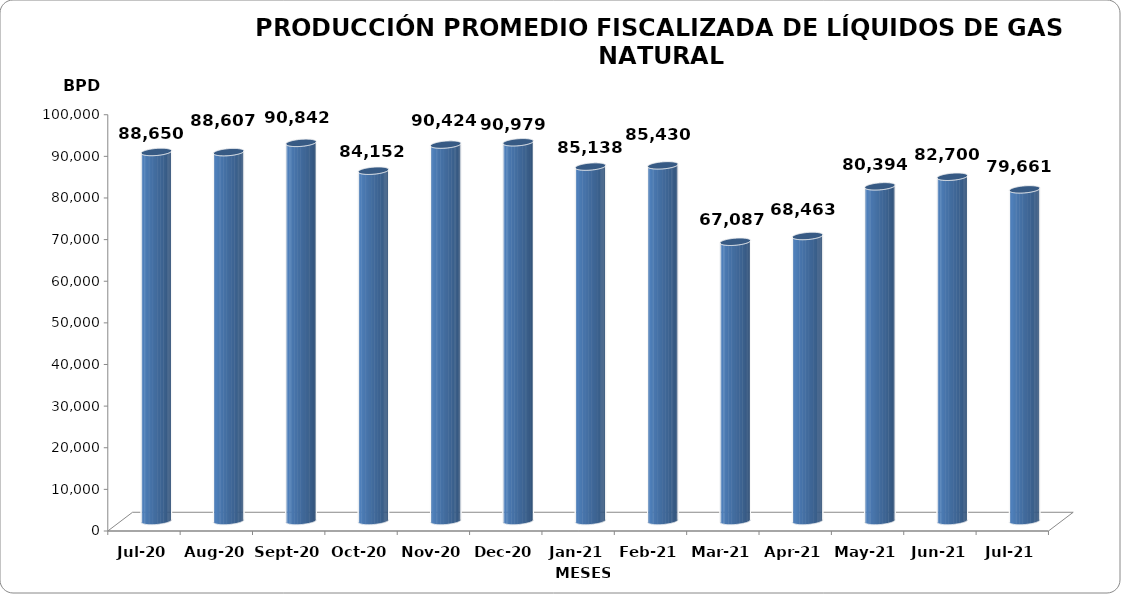
| Category | Series 0 |
|---|---|
| 2020-07-01 | 88650 |
| 2020-08-01 | 88607 |
| 2020-09-01 | 90842 |
| 2020-10-01 | 84152 |
| 2020-11-01 | 90424 |
| 2020-12-01 | 90979 |
| 2021-01-01 | 85138 |
| 2021-02-01 | 85430 |
| 2021-03-01 | 67087 |
| 2021-04-01 | 68463 |
| 2021-05-01 | 80393.645 |
| 2021-06-01 | 82699.833 |
| 2021-07-01 | 79661.29 |